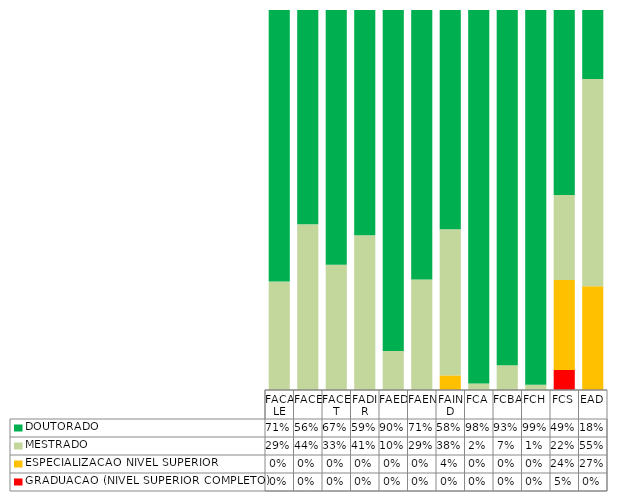
| Category | GRADUACAO (NIVEL SUPERIOR COMPLETO)   | ESPECIALIZACAO NIVEL SUPERIOR         | MESTRADO                              | DOUTORADO                             |
|---|---|---|---|---|
| FACALE | 0 | 0 | 0.286 | 0.714 |
| FACE | 0 | 0 | 0.436 | 0.564 |
| FACET | 0 | 0 | 0.33 | 0.67 |
| FADIR | 0 | 0 | 0.407 | 0.593 |
| FAED | 0 | 0 | 0.103 | 0.897 |
| FAEN | 0 | 0 | 0.291 | 0.709 |
| FAIND | 0 | 0.038 | 0.385 | 0.577 |
| FCA | 0 | 0 | 0.017 | 0.983 |
| FCBA | 0 | 0 | 0.065 | 0.935 |
| FCH | 0 | 0 | 0.014 | 0.986 |
| FCS | 0.053 | 0.237 | 0.224 | 0.487 |
| EAD | 0 | 0.273 | 0.545 | 0.182 |